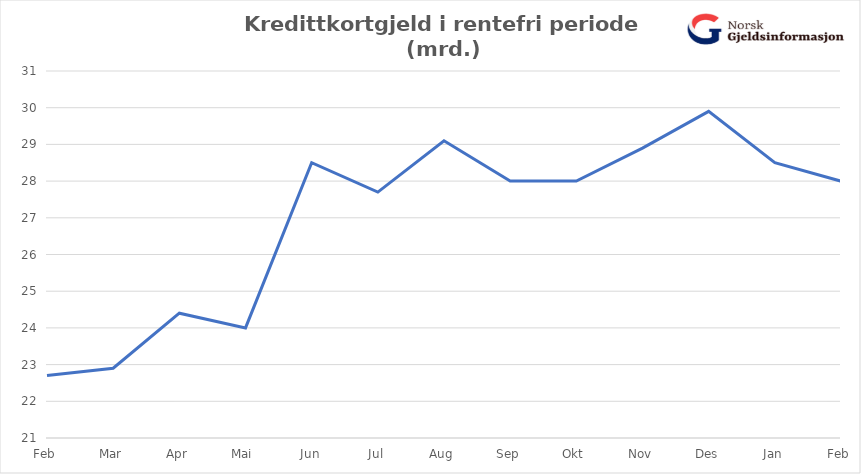
| Category | Ikke-rentebærende rammekreditt | Rentebærende rammekreditt |
|---|---|---|
| Feb | 22.7 |  |
| Mar | 22.9 |  |
| Apr | 24.4 |  |
| Mai | 24 |  |
| Jun | 28.5 |  |
| Jul | 27.7 |  |
| Aug | 29.1 |  |
| Sep | 28 |  |
| Okt | 28 |  |
| Nov | 28.9 |  |
| Des | 29.9 |  |
| Jan | 28.5 |  |
| Feb | 28 |  |